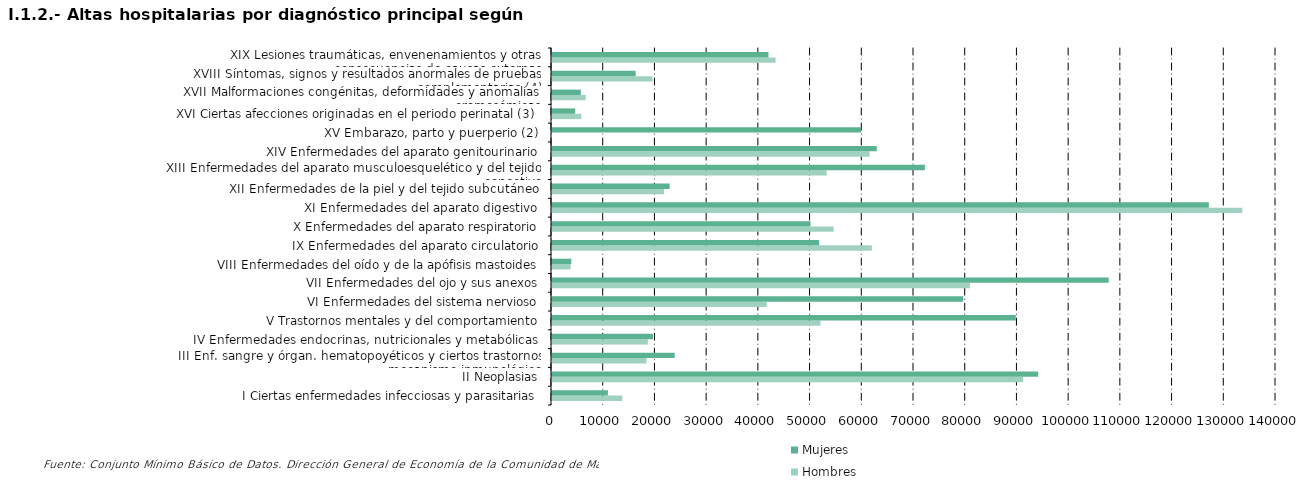
| Category | Hombres | Mujeres |
|---|---|---|
| I Ciertas enfermedades infecciosas y parasitarias | 13590 | 10813 |
| II Neoplasias | 91080 | 94009 |
| III Enf. sangre y órgan. hematopoyéticos y ciertos trastornos mecanismo inmunológico | 18267 | 23726 |
| IV Enfermedades endocrinas, nutricionales y metabólicas | 18536 | 19531 |
| V Trastornos mentales y del comportamiento | 51914 | 89681 |
| VI Enfermedades del sistema nervioso | 41531 | 79512 |
| VII Enfermedades del ojo y sus anexos | 80814 | 107648 |
| VIII Enfermedades del oído y de la apófisis mastoides | 3601 | 3740 |
| IX Enfermedades del aparato circulatorio | 61850 | 51667 |
| X Enfermedades del aparato respiratorio | 54462 | 49982 |
| XI Enfermedades del aparato digestivo | 133479 | 127015 |
| XII Enfermedades de la piel y del tejido subcutáneo | 21648 | 22748 |
| XIII Enfermedades del aparato musculoesquelético y del tejido conectivo | 53113 | 72112 |
| XIV Enfermedades del aparato genitourinario | 61425 | 62802 |
| XV Embarazo, parto y puerperio (2) | 0 | 59774 |
| XVI Ciertas afecciones originadas en el periodo perinatal (3) | 5661 | 4476 |
| XVII Malformaciones congénitas, deformidades y anomalías cromosómicas | 6526 | 5578 |
| XVIII Síntomas, signos y resultados anormales de pruebas complementarias (4) | 19434 | 16176 |
| XIX Lesiones traumáticas, envenenamientos y otras consecuencias de causas externas | 43230 | 41856 |